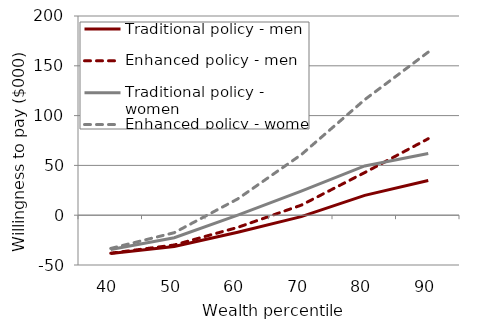
| Category | Traditional policy - men | Enhanced policy - men | Traditional policy - women | Enhanced policy - women |
|---|---|---|---|---|
| 40.0 | -38.488 | -38.14 | -34.34 | -33.34 |
| 50.0 | -31.494 | -29.91 | -22.625 | -17.558 |
| 60.0 | -17.139 | -12.233 | 0.075 | 16.357 |
| 70.0 | -1.462 | 10.087 | 24.231 | 60.756 |
| 80.0 | 19.868 | 42.81 | 49.494 | 116.026 |
| 90.0 | 34.813 | 76.796 | 61.889 | 163.768 |